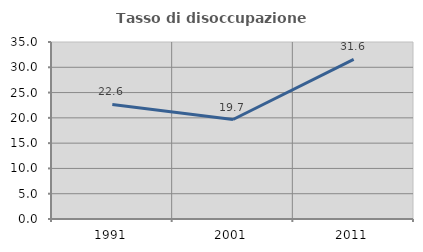
| Category | Tasso di disoccupazione giovanile  |
|---|---|
| 1991.0 | 22.642 |
| 2001.0 | 19.672 |
| 2011.0 | 31.579 |